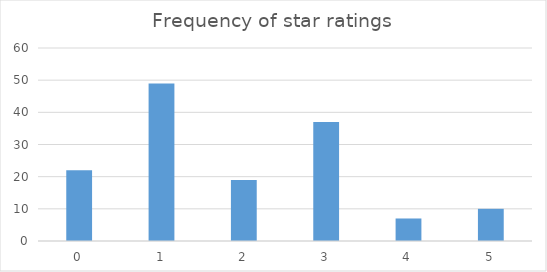
| Category | Series 0 |
|---|---|
| 0.0 | 22 |
| 1.0 | 49 |
| 2.0 | 19 |
| 3.0 | 37 |
| 4.0 | 7 |
| 5.0 | 10 |